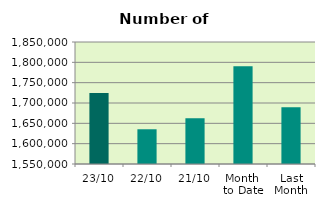
| Category | Series 0 |
|---|---|
| 23/10 | 1724886 |
| 22/10 | 1635406 |
| 21/10 | 1662498 |
| Month 
to Date | 1790262.118 |
| Last
Month | 1689477.048 |